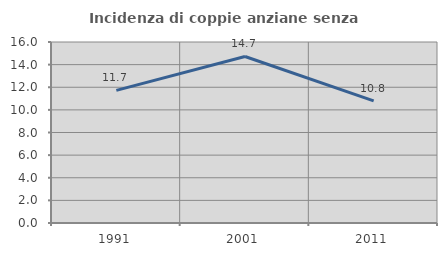
| Category | Incidenza di coppie anziane senza figli  |
|---|---|
| 1991.0 | 11.725 |
| 2001.0 | 14.72 |
| 2011.0 | 10.796 |